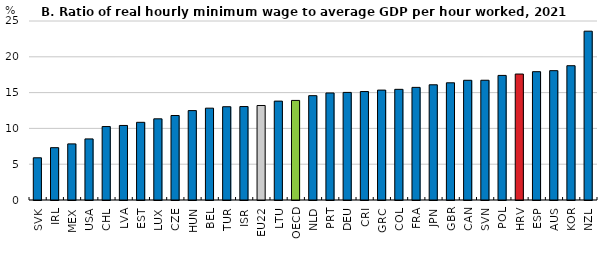
| Category | 2021 or latest |
|---|---|
| SVK | 5.896 |
| IRL | 7.308 |
| MEX | 7.835 |
| USA | 8.53 |
| CHL | 10.258 |
| LVA | 10.411 |
| EST | 10.849 |
| LUX | 11.337 |
| CZE | 11.801 |
| HUN | 12.487 |
| BEL | 12.826 |
| TUR | 13.028 |
| ISR | 13.05 |
| EU22 | 13.2 |
| LTU | 13.81 |
| OECD | 13.909 |
| NLD | 14.573 |
| PRT | 14.948 |
| DEU | 15.025 |
| CRI | 15.149 |
| GRC | 15.35 |
| COL | 15.457 |
| FRA | 15.728 |
| JPN | 16.092 |
| GBR | 16.368 |
| CAN | 16.718 |
| SVN | 16.727 |
| POL | 17.401 |
| HRV | 17.592 |
| ESP | 17.922 |
| AUS | 18.064 |
| KOR | 18.756 |
| NZL | 23.579 |